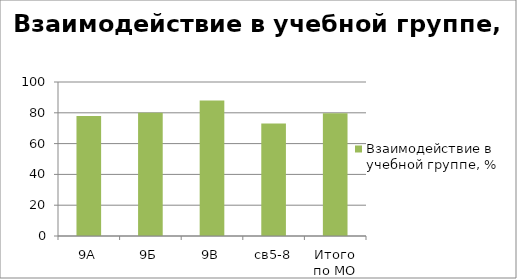
| Category | Взаимодействие в учебной группе, % |
|---|---|
| 9А | 78 |
| 9Б | 80 |
| 9В | 88 |
| св5-8 | 73 |
| Итого по МО | 79.75 |